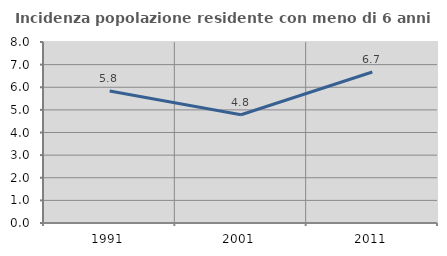
| Category | Incidenza popolazione residente con meno di 6 anni |
|---|---|
| 1991.0 | 5.83 |
| 2001.0 | 4.786 |
| 2011.0 | 6.674 |